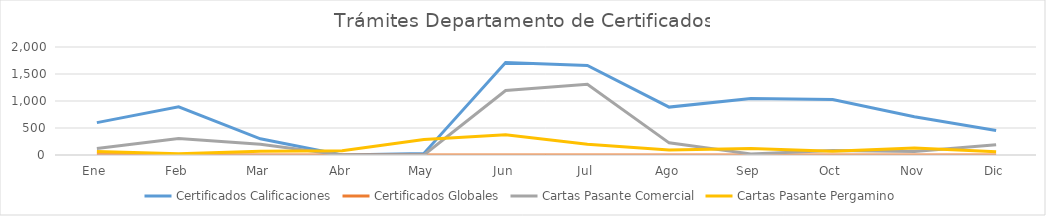
| Category | Certificados Calificaciones | Certificados Globales | Cartas Pasante Comercial | Cartas Pasante Pergamino |
|---|---|---|---|---|
| Ene | 600 | 6 | 119 | 66 |
| Feb | 891 | 5 | 304 | 21 |
| Mar | 300 | 1 | 200 | 68 |
| Abr | 0 | 0 | 0 | 80 |
| May | 30 | 0 | 0 | 287 |
| Jun | 1713 | 0 | 1195 | 376 |
| Jul | 1659 | 1 | 1308 | 198 |
| Ago | 887 | 0 | 225 | 94 |
| Sep | 1046 | 0 | 20 | 119 |
| Oct | 1027 | 0 | 84 | 70 |
| Nov | 709 | 0 | 67 | 128 |
| Dic | 454 | 0 | 189 | 59 |